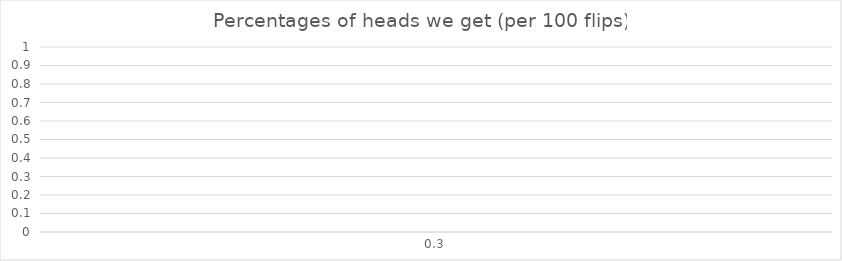
| Category | Series 0 |
|---|---|
| 0.3 | 0 |
| 0.31 | 0 |
| 0.32 | 0 |
| 0.33 | 0 |
| 0.34 | 0 |
| 0.35 | 0 |
| 0.36 | 0 |
| 0.37 | 0 |
| 0.38 | 0 |
| 0.39 | 0 |
| 0.4 | 0 |
| 0.41 | 0 |
| 0.42 | 0 |
| 0.43 | 1 |
| 0.44 | 0 |
| 0.45 | 0 |
| 0.46 | 0 |
| 0.469999999999999 | 0 |
| 0.479999999999999 | 0 |
| 0.489999999999999 | 0 |
| 0.499999999999999 | 1 |
| 0.509999999999999 | 0 |
| 0.519999999999999 | 0 |
| 0.529999999999999 | 1 |
| 0.539999999999999 | 1 |
| 0.549999999999999 | 0 |
| 0.559999999999999 | 0 |
| 0.569999999999999 | 0 |
| 0.579999999999999 | 1 |
| 0.589999999999999 | 1 |
| 0.599999999999999 | 0 |
| 0.609999999999999 | 0 |
| 0.619999999999999 | 0 |
| 0.629999999999999 | 0 |
| 0.639999999999999 | 0 |
| 0.649999999999999 | 0 |
| 0.659999999999999 | 0 |
| 0.669999999999999 | 0 |
| 0.679999999999999 | 0 |
| 0.689999999999999 | 0 |
| 0.699999999999999 | 0 |